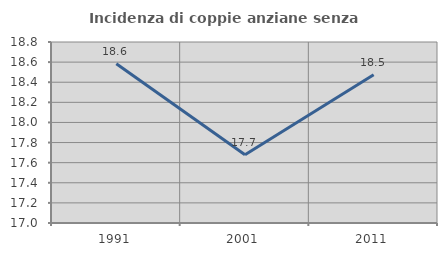
| Category | Incidenza di coppie anziane senza figli  |
|---|---|
| 1991.0 | 18.584 |
| 2001.0 | 17.68 |
| 2011.0 | 18.475 |